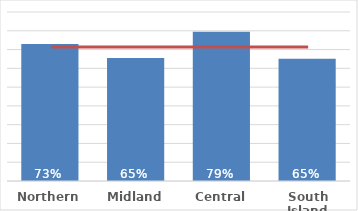
| Category | Māori |
|---|---|
| Northern | 0.729 |
| Midland | 0.655 |
| Central | 0.795 |
| South Island | 0.65 |